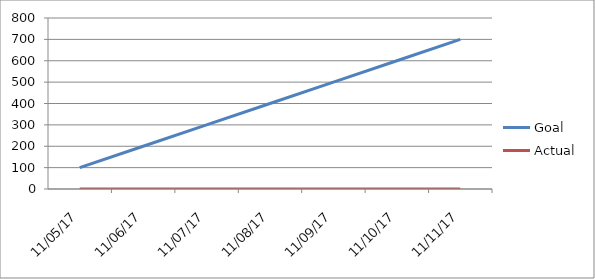
| Category | Goal | Actual |
|---|---|---|
| 2017-11-05 | 100 | 0 |
| 2017-11-06 | 200 | 0 |
| 2017-11-07 | 300 | 0 |
| 2017-11-08 | 400 | 0 |
| 2017-11-09 | 500 | 0 |
| 2017-11-10 | 600 | 0 |
| 2017-11-11 | 700 | 0 |